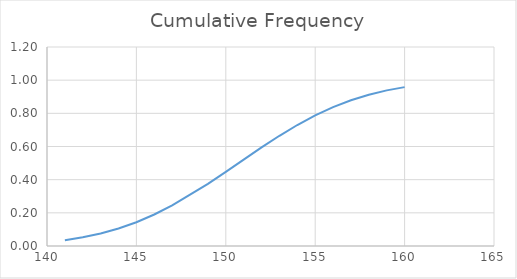
| Category | Cumulative Frequency |
|---|---|
| 141.0 | 0.035 |
| 141.0 | 0.035 |
| 141.0 | 0.035 |
| 142.0 | 0.052 |
| 142.0 | 0.052 |
| 142.0 | 0.052 |
| 143.0 | 0.075 |
| 144.0 | 0.106 |
| 144.0 | 0.106 |
| 145.0 | 0.144 |
| 145.0 | 0.144 |
| 146.0 | 0.19 |
| 146.0 | 0.19 |
| 146.0 | 0.19 |
| 147.0 | 0.244 |
| 147.0 | 0.244 |
| 147.0 | 0.244 |
| 147.0 | 0.244 |
| 147.0 | 0.244 |
| 147.0 | 0.244 |
| 149.0 | 0.375 |
| 149.0 | 0.375 |
| 149.0 | 0.375 |
| 149.0 | 0.375 |
| 150.0 | 0.447 |
| 150.0 | 0.447 |
| 150.0 | 0.447 |
| 150.0 | 0.447 |
| 151.0 | 0.521 |
| 151.0 | 0.521 |
| 151.0 | 0.521 |
| 151.0 | 0.521 |
| 152.0 | 0.594 |
| 152.0 | 0.594 |
| 152.0 | 0.594 |
| 152.0 | 0.594 |
| 153.0 | 0.665 |
| 153.0 | 0.665 |
| 153.0 | 0.665 |
| 153.0 | 0.665 |
| 153.0 | 0.665 |
| 154.0 | 0.73 |
| 154.0 | 0.73 |
| 154.0 | 0.73 |
| 154.0 | 0.73 |
| 155.0 | 0.787 |
| 155.0 | 0.787 |
| 155.0 | 0.787 |
| 156.0 | 0.837 |
| 156.0 | 0.837 |
| 156.0 | 0.837 |
| 157.0 | 0.879 |
| 158.0 | 0.913 |
| 159.0 | 0.939 |
| 159.0 | 0.939 |
| 159.0 | 0.939 |
| 159.0 | 0.939 |
| 160.0 | 0.958 |
| 160.0 | 0.958 |
| 160.0 | 0.958 |